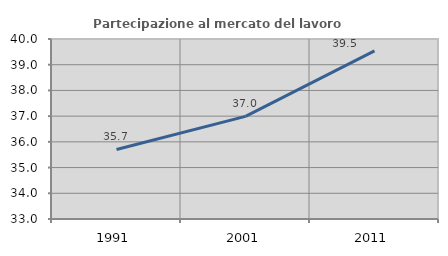
| Category | Partecipazione al mercato del lavoro  femminile |
|---|---|
| 1991.0 | 35.705 |
| 2001.0 | 36.992 |
| 2011.0 | 39.541 |